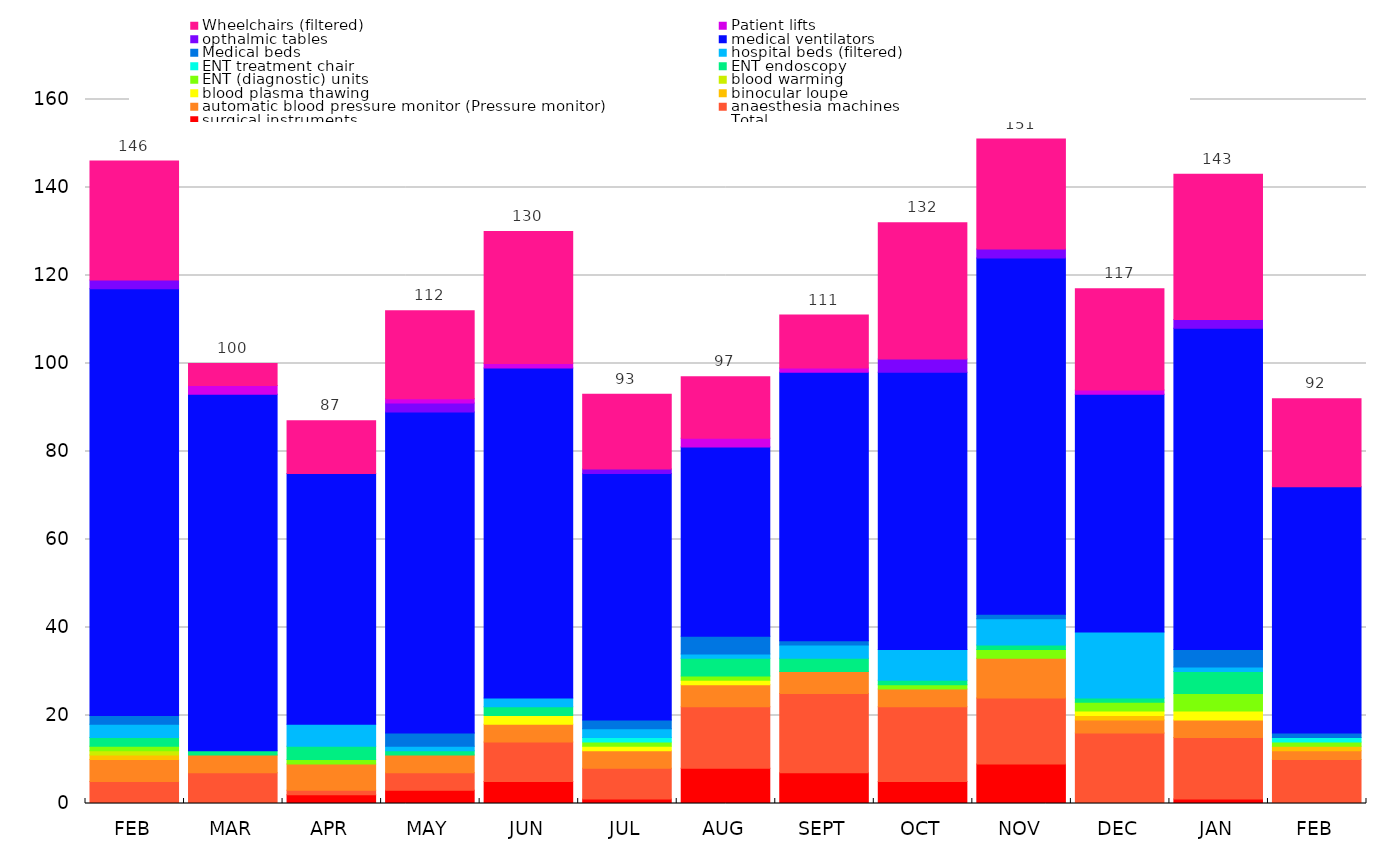
| Category | surgical instruments | anaesthesia machines | automatic blood pressure monitor (Pressure monitor) | binocular loupe | blood plasma thawing | blood warming | ENT (diagnostic) units | ENT endoscopy | ENT treatment chair | hospital beds (filtered) | Medical beds | medical ventilators | opthalmic tables | Patient lifts | Wheelchairs (filtered) |
|---|---|---|---|---|---|---|---|---|---|---|---|---|---|---|---|
| FEB | 0 | 5 | 5 | 1 | 0 | 1 | 1 | 2 | 0 | 3 | 2 | 97 | 2 | 0 | 27 |
| MAR | 0 | 7 | 4 | 0 | 0 | 0 | 0 | 1 | 0 | 0 | 0 | 81 | 0 | 2 | 5 |
| APR | 2 | 1 | 6 | 0 | 0 | 0 | 1 | 3 | 0 | 5 | 0 | 57 | 0 | 0 | 12 |
| MAY | 3 | 4 | 4 | 0 | 0 | 0 | 0 | 1 | 0 | 1 | 3 | 73 | 2 | 1 | 20 |
| JUN | 5 | 9 | 4 | 0 | 2 | 0 | 0 | 2 | 0 | 2 | 0 | 75 | 0 | 1 | 30 |
| JUL | 1 | 7 | 4 | 0 | 1 | 0 | 1 | 0 | 1 | 2 | 2 | 56 | 1 | 0 | 17 |
| AUG | 8 | 14 | 5 | 0 | 1 | 0 | 1 | 4 | 0 | 1 | 4 | 43 | 0 | 2 | 14 |
| SEPT | 7 | 18 | 5 | 0 | 0 | 0 | 0 | 3 | 0 | 3 | 1 | 61 | 0 | 1 | 12 |
| OCT | 5 | 17 | 4 | 0 | 0 | 0 | 1 | 1 | 0 | 7 | 0 | 63 | 3 | 0 | 31 |
| NOV | 9 | 15 | 9 | 0 | 0 | 0 | 2 | 1 | 0 | 6 | 1 | 81 | 2 | 0 | 25 |
| DEC | 0 | 16 | 3 | 1 | 1 | 0 | 2 | 1 | 0 | 15 | 0 | 54 | 0 | 1 | 23 |
| JAN | 1 | 14 | 4 | 0 | 2 | 0 | 4 | 5 | 0 | 1 | 4 | 73 | 2 | 0 | 33 |
| FEB | 0 | 10 | 2 | 1 | 0 | 0 | 1 | 0 | 1 | 0 | 1 | 56 | 0 | 0 | 20 |